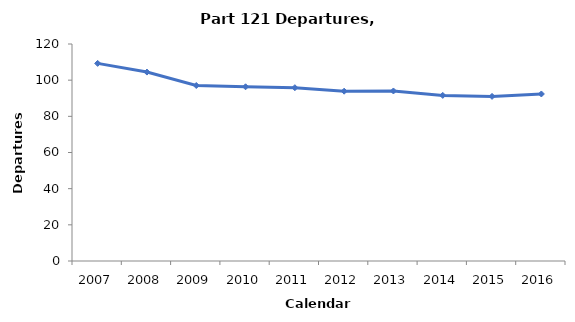
| Category | Departures (100,000s) |
|---|---|
| 2007.0 | 109.284 |
| 2008.0 | 104.481 |
| 2009.0 | 97.051 |
| 2010.0 | 96.338 |
| 2011.0 | 95.839 |
| 2012.0 | 93.907 |
| 2013.0 | 94.019 |
| 2014.0 | 91.582 |
| 2015.0 | 91.035 |
| 2016.0 | 92.362 |